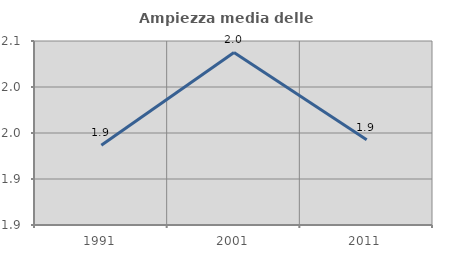
| Category | Ampiezza media delle famiglie |
|---|---|
| 1991.0 | 1.937 |
| 2001.0 | 2.038 |
| 2011.0 | 1.943 |